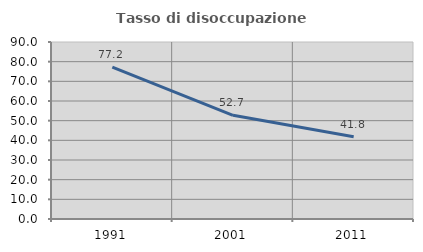
| Category | Tasso di disoccupazione giovanile  |
|---|---|
| 1991.0 | 77.193 |
| 2001.0 | 52.703 |
| 2011.0 | 41.772 |